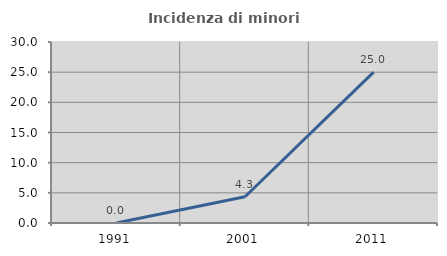
| Category | Incidenza di minori stranieri |
|---|---|
| 1991.0 | 0 |
| 2001.0 | 4.348 |
| 2011.0 | 25 |